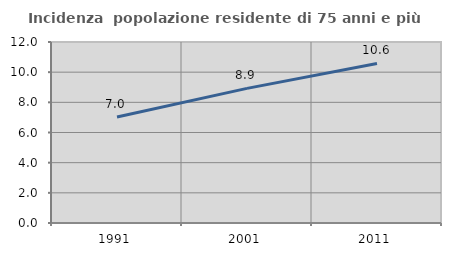
| Category | Incidenza  popolazione residente di 75 anni e più |
|---|---|
| 1991.0 | 7.032 |
| 2001.0 | 8.926 |
| 2011.0 | 10.578 |